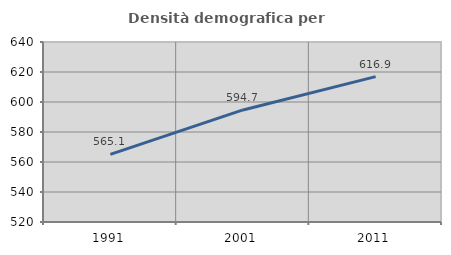
| Category | Densità demografica |
|---|---|
| 1991.0 | 565.098 |
| 2001.0 | 594.705 |
| 2011.0 | 616.942 |